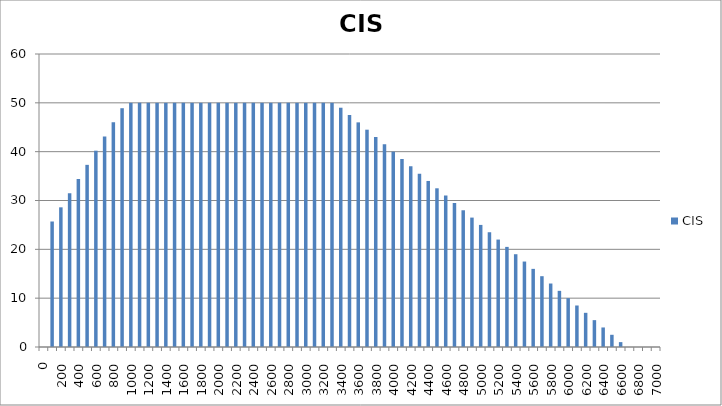
| Category | CIS |
|---|---|
| 0.0 | 0 |
| 100.0 | 25.7 |
| 200.0 | 28.6 |
| 300.0 | 31.5 |
| 400.0 | 34.4 |
| 500.0 | 37.3 |
| 600.0 | 40.2 |
| 700.0 | 43.1 |
| 800.0 | 46 |
| 900.0 | 48.9 |
| 1000.0 | 50 |
| 1100.0 | 50 |
| 1200.0 | 50 |
| 1300.0 | 50 |
| 1400.0 | 50 |
| 1500.0 | 50 |
| 1600.0 | 50 |
| 1700.0 | 50 |
| 1800.0 | 50 |
| 1900.0 | 50 |
| 2000.0 | 50 |
| 2100.0 | 50 |
| 2200.0 | 50 |
| 2300.0 | 50 |
| 2400.0 | 50 |
| 2500.0 | 50 |
| 2600.0 | 50 |
| 2700.0 | 50 |
| 2800.0 | 50 |
| 2900.0 | 50 |
| 3000.0 | 50 |
| 3100.0 | 50 |
| 3200.0 | 50 |
| 3300.0 | 50 |
| 3400.0 | 49 |
| 3500.0 | 47.5 |
| 3600.0 | 46 |
| 3700.0 | 44.5 |
| 3800.0 | 43 |
| 3900.0 | 41.5 |
| 4000.0 | 40 |
| 4100.0 | 38.5 |
| 4200.0 | 37 |
| 4300.0 | 35.5 |
| 4400.0 | 34 |
| 4500.0 | 32.5 |
| 4600.0 | 31 |
| 4700.0 | 29.5 |
| 4800.0 | 28 |
| 4900.0 | 26.5 |
| 5000.0 | 25 |
| 5100.0 | 23.5 |
| 5200.0 | 22 |
| 5300.0 | 20.5 |
| 5400.0 | 19 |
| 5500.0 | 17.5 |
| 5600.0 | 16 |
| 5700.0 | 14.5 |
| 5800.0 | 13 |
| 5900.0 | 11.5 |
| 6000.0 | 10 |
| 6100.0 | 8.5 |
| 6200.0 | 7 |
| 6300.0 | 5.5 |
| 6400.0 | 4 |
| 6500.0 | 2.5 |
| 6600.0 | 1 |
| 6700.0 | 0 |
| 6800.0 | 0 |
| 6900.0 | 0 |
| 7000.0 | 0 |